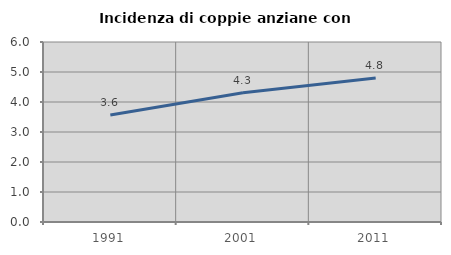
| Category | Incidenza di coppie anziane con figli |
|---|---|
| 1991.0 | 3.566 |
| 2001.0 | 4.309 |
| 2011.0 | 4.799 |